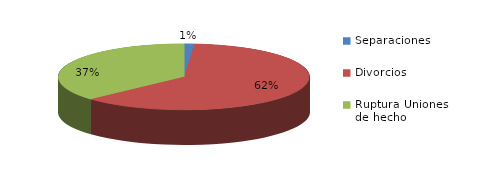
| Category | Series 0 |
|---|---|
| Separaciones | 23 |
| Divorcios | 1058 |
| Ruptura Uniones de hecho | 630 |